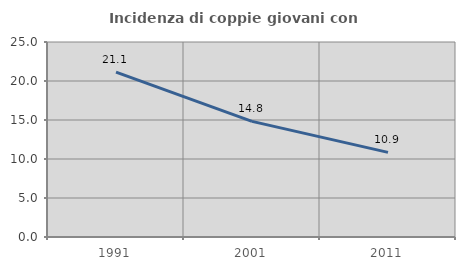
| Category | Incidenza di coppie giovani con figli |
|---|---|
| 1991.0 | 21.129 |
| 2001.0 | 14.827 |
| 2011.0 | 10.854 |